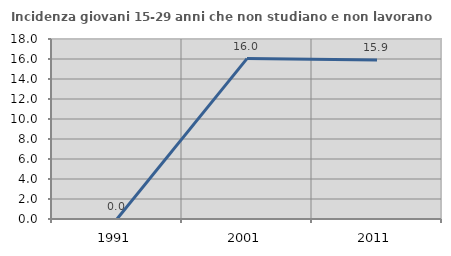
| Category | Incidenza giovani 15-29 anni che non studiano e non lavorano  |
|---|---|
| 1991.0 | 0 |
| 2001.0 | 16.038 |
| 2011.0 | 15.909 |